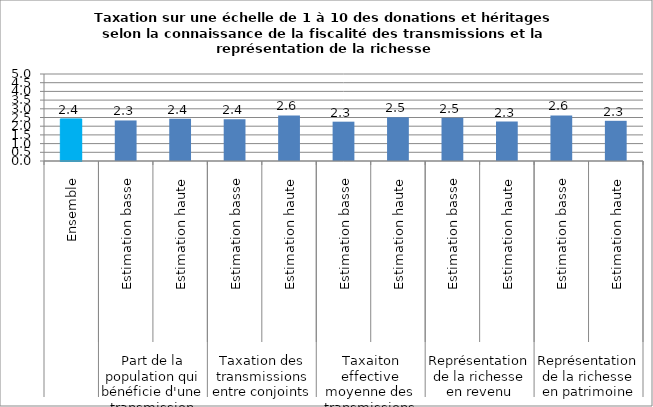
| Category | Les donations ou héritage |
|---|---|
| 0 | 2.42 |
| 1 | 2.33 |
| 2 | 2.43 |
| 3 | 2.4 |
| 4 | 2.62 |
| 5 | 2.26 |
| 6 | 2.51 |
| 7 | 2.48 |
| 8 | 2.27 |
| 9 | 2.62 |
| 10 | 2.31 |